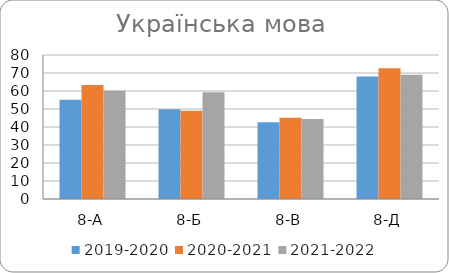
| Category | 2019-2020 | 2020-2021 | 2021-2022 |
|---|---|---|---|
| 8-А | 55.1 | 63.3 | 60.1 |
| 8-Б | 49.9 | 49 | 59.3 |
| 8-В | 42.7 | 45.2 | 44.5 |
| 8-Д | 68.1 | 72.6 | 69 |